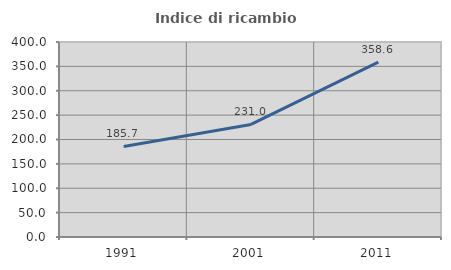
| Category | Indice di ricambio occupazionale  |
|---|---|
| 1991.0 | 185.714 |
| 2001.0 | 230.952 |
| 2011.0 | 358.621 |